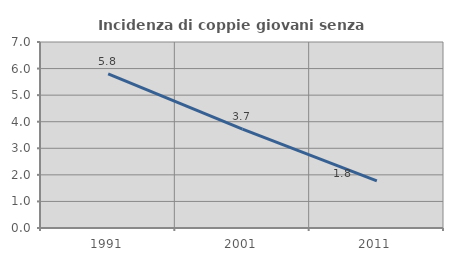
| Category | Incidenza di coppie giovani senza figli |
|---|---|
| 1991.0 | 5.805 |
| 2001.0 | 3.72 |
| 2011.0 | 1.774 |